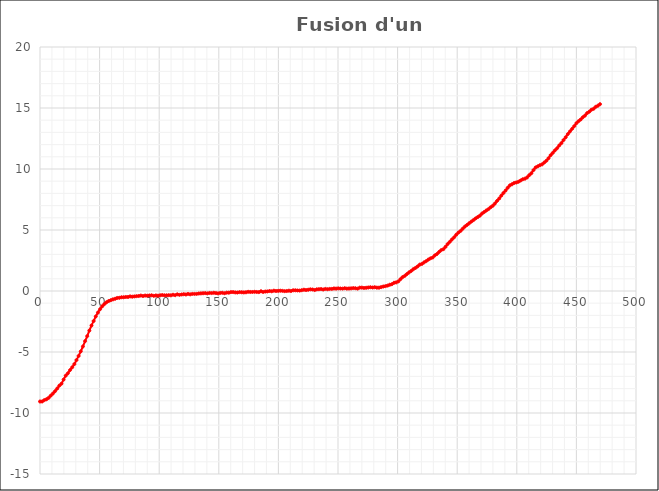
| Category | Température (°C) |
|---|---|
| 0.0 | -9.058 |
| 1.81 | -9.058 |
| 3.604 | -8.944 |
| 5.413 | -8.875 |
| 7.207 | -8.761 |
| 9.001 | -8.579 |
| 10.811 | -8.408 |
| 12.605 | -8.215 |
| 14.415 | -7.998 |
| 16.209 | -7.759 |
| 18.003 | -7.599 |
| 19.812 | -7.257 |
| 21.606 | -6.938 |
| 23.4 | -6.745 |
| 25.21 | -6.483 |
| 27.004 | -6.255 |
| 28.814 | -5.993 |
| 30.608 | -5.662 |
| 32.402 | -5.321 |
| 34.211 | -4.945 |
| 36.005 | -4.546 |
| 37.815 | -4.113 |
| 39.609 | -3.703 |
| 41.403 | -3.247 |
| 43.212 | -2.826 |
| 45.006 | -2.461 |
| 46.8 | -2.085 |
| 48.61 | -1.766 |
| 50.404 | -1.492 |
| 52.214 | -1.253 |
| 54.008 | -1.071 |
| 55.802 | -0.923 |
| 57.611 | -0.82 |
| 59.405 | -0.752 |
| 61.215 | -0.684 |
| 63.009 | -0.638 |
| 64.803 | -0.57 |
| 66.613 | -0.558 |
| 68.407 | -0.513 |
| 70.201 | -0.513 |
| 72.01 | -0.49 |
| 73.804 | -0.49 |
| 75.614 | -0.444 |
| 77.408 | -0.467 |
| 79.202 | -0.444 |
| 81.011 | -0.422 |
| 82.805 | -0.41 |
| 84.6 | -0.376 |
| 86.409 | -0.41 |
| 88.203 | -0.376 |
| 90.013 | -0.387 |
| 91.807 | -0.365 |
| 93.601 | -0.353 |
| 95.41 | -0.399 |
| 97.204 | -0.365 |
| 99.014 | -0.387 |
| 100.808 | -0.353 |
| 102.602 | -0.33 |
| 104.412 | -0.353 |
| 106.206 | -0.353 |
| 108.0 | -0.342 |
| 109.809 | -0.353 |
| 111.603 | -0.308 |
| 113.413 | -0.342 |
| 115.207 | -0.273 |
| 117.001 | -0.319 |
| 118.811 | -0.285 |
| 120.605 | -0.262 |
| 122.414 | -0.285 |
| 124.208 | -0.239 |
| 126.002 | -0.273 |
| 127.812 | -0.239 |
| 129.606 | -0.239 |
| 131.4 | -0.239 |
| 133.209 | -0.205 |
| 135.003 | -0.194 |
| 136.813 | -0.182 |
| 138.607 | -0.171 |
| 140.401 | -0.194 |
| 142.211 | -0.159 |
| 144.005 | -0.171 |
| 145.814 | -0.148 |
| 147.608 | -0.171 |
| 149.402 | -0.194 |
| 151.212 | -0.159 |
| 153.006 | -0.148 |
| 154.8 | -0.182 |
| 156.61 | -0.137 |
| 158.404 | -0.137 |
| 160.213 | -0.091 |
| 162.007 | -0.091 |
| 163.801 | -0.114 |
| 165.611 | -0.125 |
| 167.405 | -0.091 |
| 169.214 | -0.103 |
| 171.008 | -0.114 |
| 172.802 | -0.103 |
| 174.612 | -0.068 |
| 176.406 | -0.08 |
| 178.2 | -0.08 |
| 180.01 | -0.068 |
| 181.804 | -0.08 |
| 183.613 | -0.091 |
| 185.407 | -0.023 |
| 187.201 | -0.08 |
| 189.011 | -0.046 |
| 190.805 | -0.034 |
| 192.615 | 0 |
| 194.409 | -0.023 |
| 196.203 | 0.023 |
| 198.012 | 0 |
| 199.806 | 0.011 |
| 201.6 | 0.023 |
| 203.41 | 0.011 |
| 205.204 | -0.011 |
| 207.013 | 0 |
| 208.808 | 0.023 |
| 210.602 | 0 |
| 212.411 | 0.057 |
| 214.205 | 0.057 |
| 216.015 | 0.046 |
| 217.809 | 0.034 |
| 219.603 | 0.068 |
| 221.412 | 0.103 |
| 223.206 | 0.08 |
| 225.0 | 0.103 |
| 226.81 | 0.137 |
| 228.604 | 0.125 |
| 230.414 | 0.08 |
| 232.208 | 0.137 |
| 234.002 | 0.148 |
| 235.811 | 0.16 |
| 237.605 | 0.125 |
| 239.415 | 0.171 |
| 241.209 | 0.148 |
| 243.003 | 0.171 |
| 244.813 | 0.171 |
| 246.607 | 0.205 |
| 248.401 | 0.194 |
| 250.21 | 0.216 |
| 252.004 | 0.205 |
| 253.814 | 0.194 |
| 255.608 | 0.228 |
| 257.402 | 0.194 |
| 259.211 | 0.205 |
| 261.005 | 0.216 |
| 262.815 | 0.239 |
| 264.609 | 0.228 |
| 266.403 | 0.194 |
| 268.213 | 0.273 |
| 270.007 | 0.273 |
| 271.801 | 0.251 |
| 273.61 | 0.262 |
| 275.404 | 0.285 |
| 277.214 | 0.308 |
| 279.008 | 0.285 |
| 280.802 | 0.308 |
| 282.612 | 0.273 |
| 284.406 | 0.273 |
| 286.2 | 0.319 |
| 288.009 | 0.365 |
| 289.803 | 0.399 |
| 291.613 | 0.444 |
| 293.407 | 0.513 |
| 295.201 | 0.558 |
| 297.01 | 0.672 |
| 298.804 | 0.706 |
| 300.614 | 0.786 |
| 302.408 | 0.968 |
| 304.202 | 1.139 |
| 306.012 | 1.242 |
| 307.806 | 1.39 |
| 309.6 | 1.527 |
| 311.409 | 1.641 |
| 313.203 | 1.789 |
| 315.013 | 1.891 |
| 316.807 | 2.017 |
| 318.601 | 2.165 |
| 320.411 | 2.222 |
| 322.205 | 2.347 |
| 324.014 | 2.45 |
| 325.808 | 2.575 |
| 327.602 | 2.677 |
| 329.412 | 2.746 |
| 331.206 | 2.917 |
| 333.0 | 3.031 |
| 334.81 | 3.202 |
| 336.604 | 3.35 |
| 338.413 | 3.429 |
| 340.207 | 3.623 |
| 342.001 | 3.851 |
| 343.811 | 4.033 |
| 345.605 | 4.227 |
| 347.414 | 4.398 |
| 349.208 | 4.614 |
| 351.002 | 4.785 |
| 352.812 | 4.922 |
| 354.606 | 5.104 |
| 356.4 | 5.275 |
| 358.21 | 5.412 |
| 360.004 | 5.549 |
| 361.813 | 5.685 |
| 363.607 | 5.811 |
| 365.401 | 5.947 |
| 367.211 | 6.061 |
| 369.005 | 6.175 |
| 370.815 | 6.346 |
| 372.609 | 6.471 |
| 374.403 | 6.597 |
| 376.212 | 6.711 |
| 378.006 | 6.859 |
| 379.8 | 6.984 |
| 381.61 | 7.166 |
| 383.404 | 7.383 |
| 385.213 | 7.577 |
| 387.007 | 7.816 |
| 388.801 | 8.032 |
| 390.611 | 8.237 |
| 392.405 | 8.465 |
| 394.215 | 8.659 |
| 396.009 | 8.75 |
| 397.803 | 8.853 |
| 399.612 | 8.898 |
| 401.406 | 8.955 |
| 403.2 | 9.058 |
| 405.01 | 9.16 |
| 406.804 | 9.206 |
| 408.614 | 9.308 |
| 410.408 | 9.491 |
| 412.202 | 9.65 |
| 414.011 | 9.912 |
| 415.805 | 10.129 |
| 417.615 | 10.22 |
| 419.409 | 10.311 |
| 421.203 | 10.379 |
| 423.012 | 10.527 |
| 424.806 | 10.676 |
| 426.601 | 10.881 |
| 428.41 | 11.131 |
| 430.204 | 11.325 |
| 432.014 | 11.53 |
| 433.808 | 11.701 |
| 435.602 | 11.929 |
| 437.411 | 12.122 |
| 439.205 | 12.373 |
| 441.015 | 12.601 |
| 442.809 | 12.863 |
| 444.603 | 13.079 |
| 446.413 | 13.296 |
| 448.207 | 13.512 |
| 450.001 | 13.752 |
| 451.81 | 13.922 |
| 453.604 | 14.059 |
| 455.414 | 14.242 |
| 457.208 | 14.378 |
| 459.002 | 14.583 |
| 460.812 | 14.697 |
| 462.606 | 14.857 |
| 464.4 | 14.936 |
| 466.209 | 15.096 |
| 468.003 | 15.187 |
| 469.813 | 15.313 |